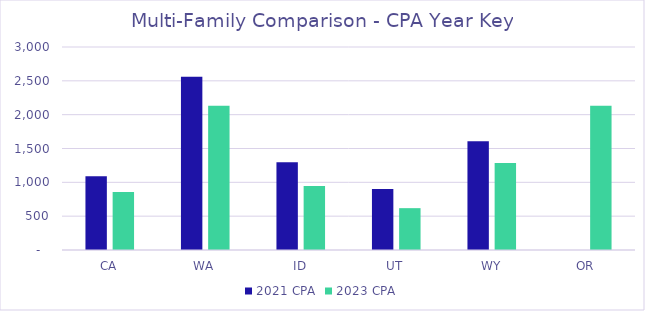
| Category | 2021 CPA | 2023 CPA |
|---|---|---|
|  CA  | 1088.584 | 858.44 |
|  WA  | 2560.864 | 2130.89 |
|  ID  | 1296.568 | 944.906 |
|  UT  | 902.547 | 618.378 |
|  WY  | 1608.358 | 1286.288 |
|  OR  | 0 | 2132.395 |